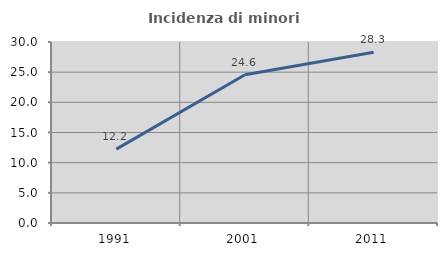
| Category | Incidenza di minori stranieri |
|---|---|
| 1991.0 | 12.245 |
| 2001.0 | 24.561 |
| 2011.0 | 28.311 |